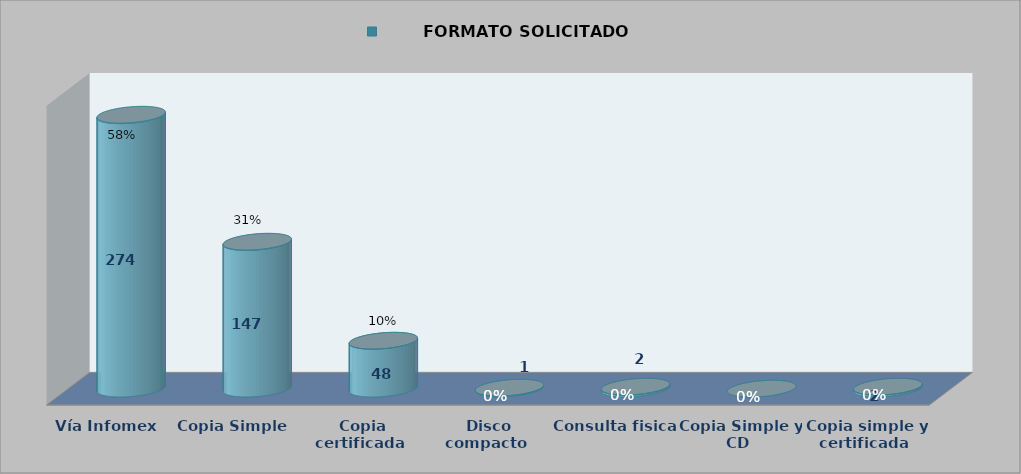
| Category |        FORMATO SOLICITADO | Series 1 | Series 2 |
|---|---|---|---|
| Vía Infomex  | 0.578 |  | 274 |
| Copia Simple  | 0.31 |  | 147 |
| Copia certificada  | 0.101 |  | 48 |
| Disco compacto  | 0.002 |  | 1 |
| Consulta fisica  | 0.004 |  | 2 |
| Copia Simple y CD  | 0 |  | 0 |
| Copia simple y certificada  | 0.004 |  | 2 |